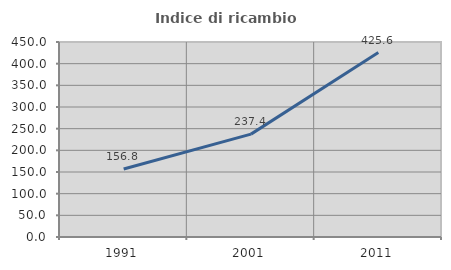
| Category | Indice di ricambio occupazionale  |
|---|---|
| 1991.0 | 156.8 |
| 2001.0 | 237.391 |
| 2011.0 | 425.556 |